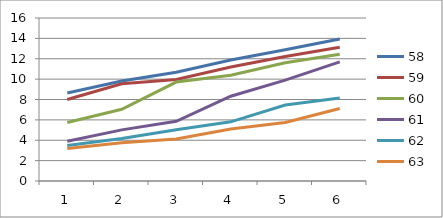
| Category | 58 | 59 | 60 | 61 | 62 | 63 |
|---|---|---|---|---|---|---|
| 0 | 8.632 | 8.006 | 5.75 | 3.908 | 3.493 | 3.187 |
| 1 | 9.807 | 9.541 | 7.036 | 5.019 | 4.174 | 3.759 |
| 2 | 10.672 | 9.959 | 9.712 | 5.859 | 5.035 | 4.126 |
| 3 | 11.871 | 11.188 | 10.38 | 8.322 | 5.807 | 5.11 |
| 4 | 12.882 | 12.218 | 11.611 | 9.905 | 7.455 | 5.747 |
| 5 | 13.944 | 13.131 | 12.446 | 11.696 | 8.147 | 7.12 |